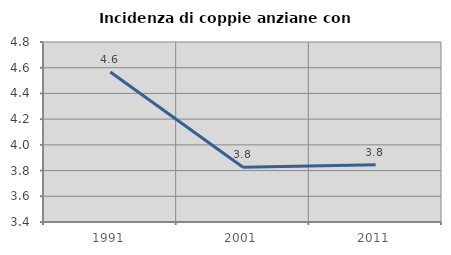
| Category | Incidenza di coppie anziane con figli |
|---|---|
| 1991.0 | 4.566 |
| 2001.0 | 3.825 |
| 2011.0 | 3.846 |